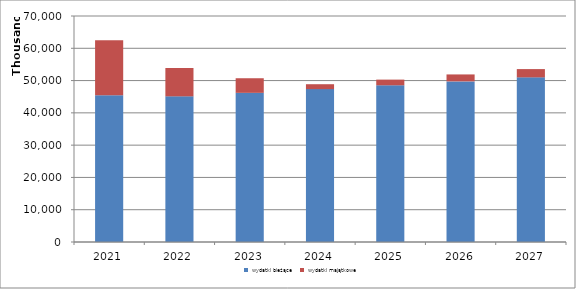
| Category | wydatki bieżące | wydatki majątkowe |
|---|---|---|
| 2021.0 | 45477372 | 16978022 |
| 2022.0 | 45115561 | 8785193 |
| 2023.0 | 46198335 | 4524441 |
| 2024.0 | 47353293 | 1519167 |
| 2025.0 | 48537126 | 1758958 |
| 2026.0 | 49750554 | 2151208 |
| 2027.0 | 50994317 | 2562900 |